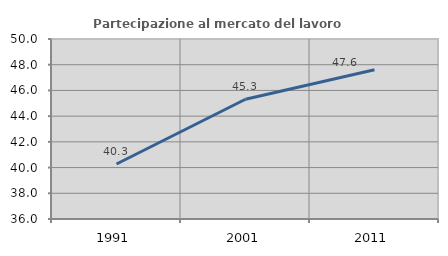
| Category | Partecipazione al mercato del lavoro  femminile |
|---|---|
| 1991.0 | 40.276 |
| 2001.0 | 45.313 |
| 2011.0 | 47.603 |